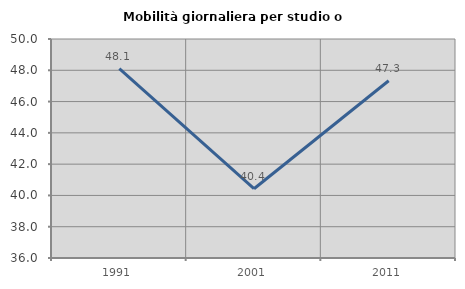
| Category | Mobilità giornaliera per studio o lavoro |
|---|---|
| 1991.0 | 48.1 |
| 2001.0 | 40.428 |
| 2011.0 | 47.328 |